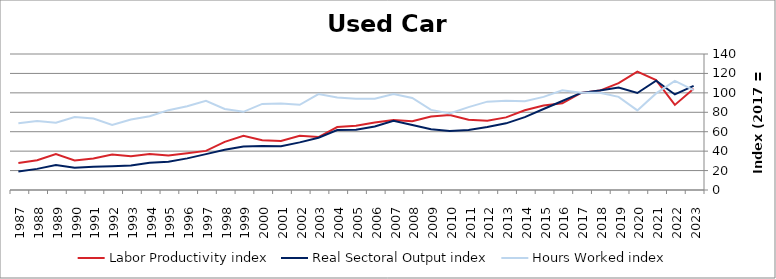
| Category | Labor Productivity index | Real Sectoral Output index | Hours Worked index |
|---|---|---|---|
| 2023.0 | 104.283 | 107.161 | 102.76 |
| 2022.0 | 87.588 | 98.353 | 112.291 |
| 2021.0 | 113.138 | 112.52 | 99.454 |
| 2020.0 | 121.878 | 99.824 | 81.906 |
| 2019.0 | 110.057 | 105.548 | 95.904 |
| 2018.0 | 102.329 | 102.482 | 100.149 |
| 2017.0 | 100 | 100 | 100 |
| 2016.0 | 89.254 | 91.575 | 102.6 |
| 2015.0 | 86.94 | 83.347 | 95.867 |
| 2014.0 | 82.134 | 74.982 | 91.292 |
| 2013.0 | 74.754 | 68.616 | 91.788 |
| 2012.0 | 71.268 | 64.819 | 90.952 |
| 2011.0 | 72.347 | 61.734 | 85.33 |
| 2010.0 | 77.213 | 60.852 | 78.811 |
| 2009.0 | 75.751 | 62.451 | 82.442 |
| 2008.0 | 70.746 | 66.991 | 94.693 |
| 2007.0 | 72.139 | 71.352 | 98.91 |
| 2006.0 | 69.58 | 65.35 | 93.921 |
| 2005.0 | 66.089 | 62.122 | 93.997 |
| 2004.0 | 64.742 | 61.648 | 95.222 |
| 2003.0 | 54.519 | 53.831 | 98.737 |
| 2002.0 | 55.852 | 49.014 | 87.757 |
| 2001.0 | 50.491 | 44.973 | 89.073 |
| 2000.0 | 51.171 | 45.341 | 88.606 |
| 1999.0 | 55.705 | 44.825 | 80.47 |
| 1998.0 | 49.586 | 41.357 | 83.405 |
| 1997.0 | 40.259 | 36.925 | 91.719 |
| 1996.0 | 37.764 | 32.552 | 86.197 |
| 1995.0 | 35.424 | 29.119 | 82.201 |
| 1994.0 | 36.952 | 28.057 | 75.927 |
| 1993.0 | 34.762 | 25.219 | 72.548 |
| 1992.0 | 36.451 | 24.399 | 66.937 |
| 1991.0 | 32.381 | 23.848 | 73.646 |
| 1990.0 | 30.376 | 22.85 | 75.224 |
| 1989.0 | 37.01 | 25.665 | 69.346 |
| 1988.0 | 30.666 | 21.749 | 70.921 |
| 1987.0 | 27.881 | 19.154 | 68.699 |